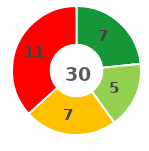
| Category | Series 0 |
|---|---|
| 0 | 7 |
| 1 | 5 |
| 2 | 7 |
| 3 | 11 |
| 4 | 0 |